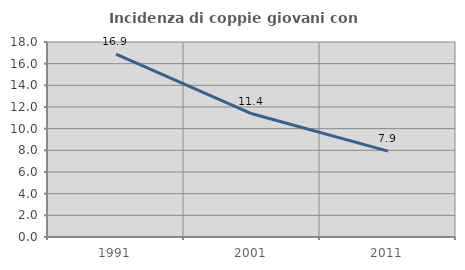
| Category | Incidenza di coppie giovani con figli |
|---|---|
| 1991.0 | 16.889 |
| 2001.0 | 11.371 |
| 2011.0 | 7.925 |